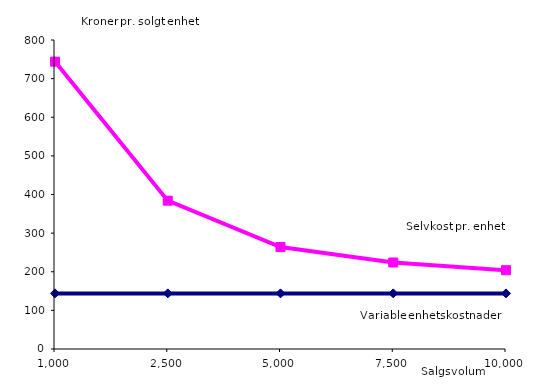
| Category | Series 0 | Series 1 |
|---|---|---|
| 1000.0 | 144 | 744 |
| 2500.0 | 144 | 384 |
| 5000.0 | 144 | 264 |
| 7500.0 | 144 | 224 |
| 10000.0 | 144 | 204 |